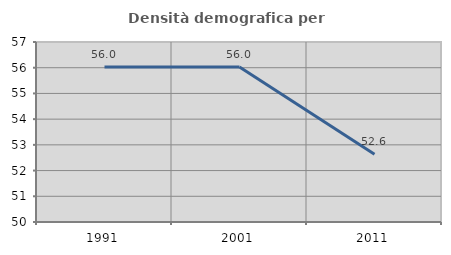
| Category | Densità demografica |
|---|---|
| 1991.0 | 56.027 |
| 2001.0 | 56.027 |
| 2011.0 | 52.636 |